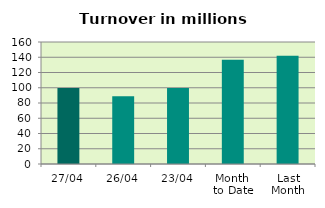
| Category | Series 0 |
|---|---|
| 27/04 | 99.756 |
| 26/04 | 88.743 |
| 23/04 | 99.629 |
| Month 
to Date | 136.573 |
| Last
Month | 142.086 |